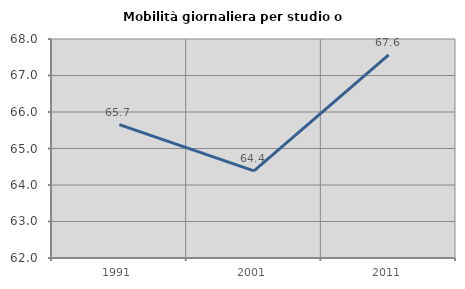
| Category | Mobilità giornaliera per studio o lavoro |
|---|---|
| 1991.0 | 65.652 |
| 2001.0 | 64.386 |
| 2011.0 | 67.568 |